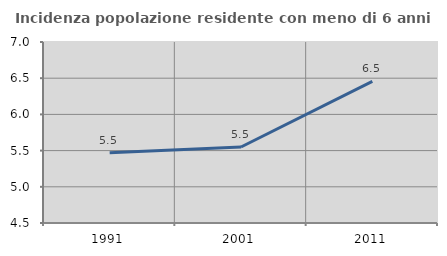
| Category | Incidenza popolazione residente con meno di 6 anni |
|---|---|
| 1991.0 | 5.469 |
| 2001.0 | 5.55 |
| 2011.0 | 6.456 |